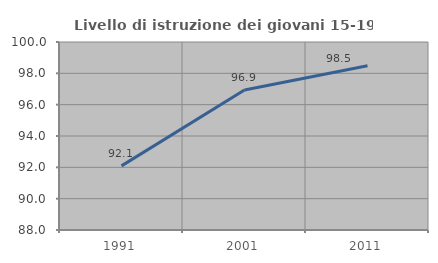
| Category | Livello di istruzione dei giovani 15-19 anni |
|---|---|
| 1991.0 | 92.093 |
| 2001.0 | 96.939 |
| 2011.0 | 98.479 |